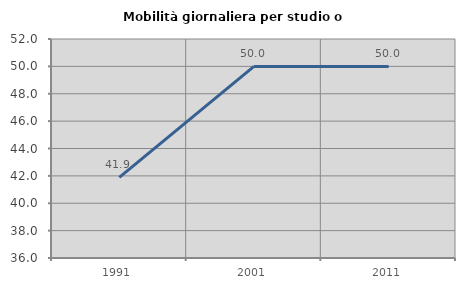
| Category | Mobilità giornaliera per studio o lavoro |
|---|---|
| 1991.0 | 41.892 |
| 2001.0 | 50 |
| 2011.0 | 50 |